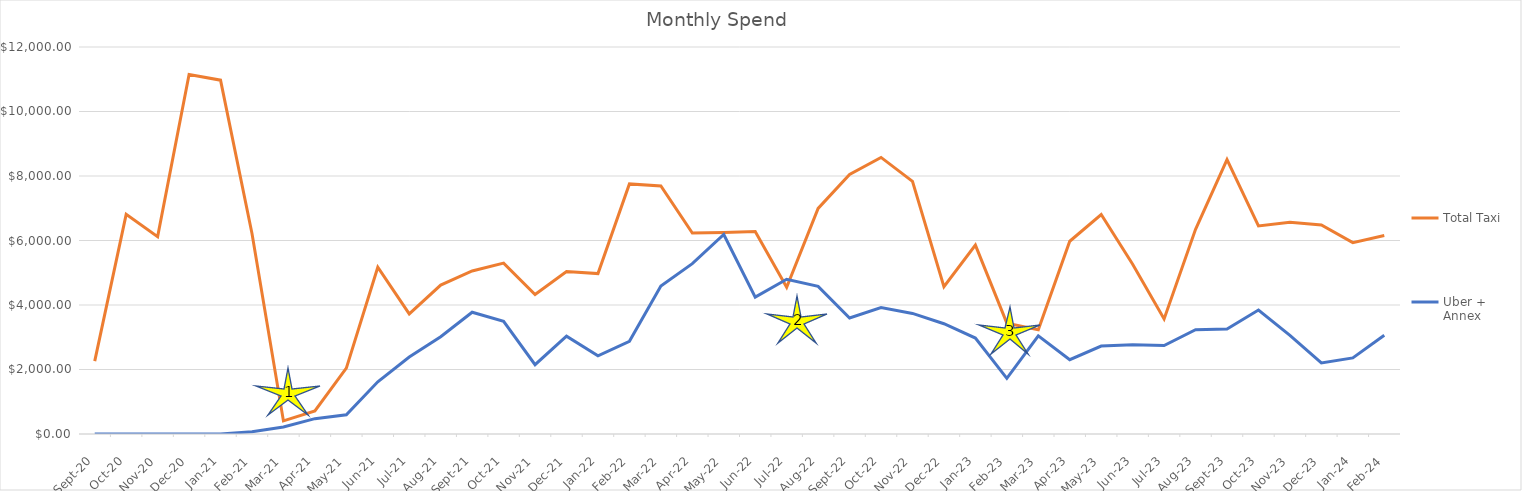
| Category | Total Taxi | Uber + Annex |
|---|---|---|
| 2020-09-01 | 2261.5 | 0 |
| 2020-10-01 | 6810.3 | 0 |
| 2020-11-01 | 6119.6 | 0 |
| 2020-12-01 | 11144.6 | 0 |
| 2021-01-01 | 10971.5 | 0 |
| 2021-02-01 | 6218 | 73.1 |
| 2021-03-01 | 406.5 | 218.64 |
| 2021-04-01 | 714 | 476.11 |
| 2021-05-01 | 2043 | 598.13 |
| 2021-06-01 | 5170.3 | 1618.72 |
| 2021-07-01 | 3724.5 | 2388.37 |
| 2021-08-01 | 4617.5 | 3017.75 |
| 2021-09-01 | 5056.5 | 3774.34 |
| 2021-10-01 | 5300.3 | 3492.27 |
| 2021-11-01 | 4323.3 | 2147.85 |
| 2021-12-01 | 5040 | 3032.66 |
| 2022-01-01 | 4973.9 | 2426.53 |
| 2022-02-01 | 7755.5 | 2872.53 |
| 2022-03-01 | 7691.3 | 4590.11 |
| 2022-04-01 | 6230.5 | 5282.77 |
| 2022-05-01 | 6246.1 | 6185.38 |
| 2022-06-01 | 6277 | 4243.07 |
| 2022-07-01 | 4549.4 | 4798.18 |
| 2022-08-01 | 6995.95 | 4578.69 |
| 2022-09-01 | 8047.45 | 3598.24 |
| 2022-10-01 | 8576 | 3921.32 |
| 2022-11-01 | 7833.65 | 3738.53 |
| 2022-12-01 | 4565.3 | 3419.72 |
| 2023-01-01 | 5856.35 | 2975.65 |
| 2023-02-01 | 3438 | 1724.79 |
| 2023-03-01 | 3234.3 | 3045.43 |
| 2023-04-01 | 5977.1 | 2303.51 |
| 2023-05-01 | 6804.05 | 2726.23 |
| 2023-06-01 | 5261.9 | 2766.79 |
| 2023-07-01 | 3569.1 | 2741.18 |
| 2023-08-01 | 6346.55 | 3235.79 |
| 2023-09-01 | 8508.95 | 3258.22 |
| 2023-10-01 | 6453.25 | 3843.71 |
| 2023-11-01 | 6564.5 | 3056.46 |
| 2023-12-01 | 6480.95 | 2203.66 |
| 2024-01-01 | 5933.55 | 2358.25 |
| 2024-02-01 | 6153.45 | 3064.52 |